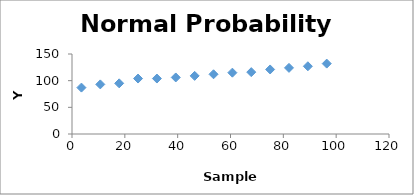
| Category | Series 0 |
|---|---|
| 3.5714285714285716 | 87 |
| 10.714285714285715 | 93 |
| 17.857142857142858 | 95 |
| 25.000000000000004 | 104 |
| 32.142857142857146 | 104 |
| 39.285714285714285 | 106 |
| 46.42857142857143 | 109 |
| 53.57142857142857 | 112 |
| 60.714285714285715 | 115 |
| 67.85714285714286 | 116 |
| 75.0 | 121 |
| 82.14285714285714 | 124 |
| 89.28571428571429 | 127 |
| 96.42857142857143 | 132 |